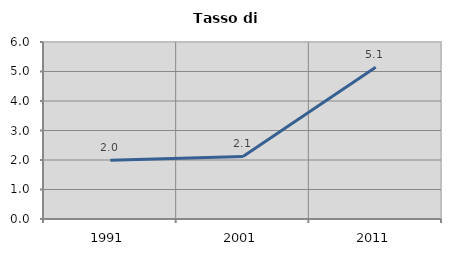
| Category | Tasso di disoccupazione   |
|---|---|
| 1991.0 | 1.992 |
| 2001.0 | 2.121 |
| 2011.0 | 5.147 |